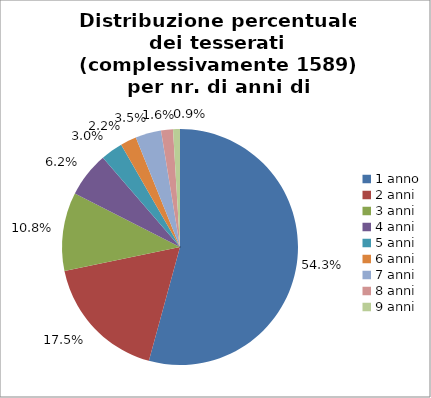
| Category | Nr. Tesserati |
|---|---|
| 1 anno | 862 |
| 2 anni | 278 |
| 3 anni | 171 |
| 4 anni | 98 |
| 5 anni | 48 |
| 6 anni | 35 |
| 7 anni | 56 |
| 8 anni | 26 |
| 9 anni | 15 |